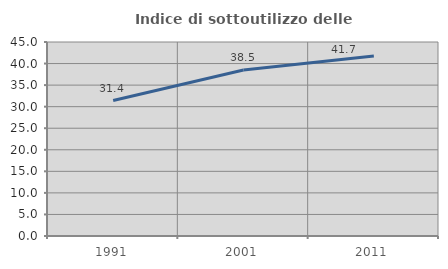
| Category | Indice di sottoutilizzo delle abitazioni  |
|---|---|
| 1991.0 | 31.42 |
| 2001.0 | 38.498 |
| 2011.0 | 41.741 |